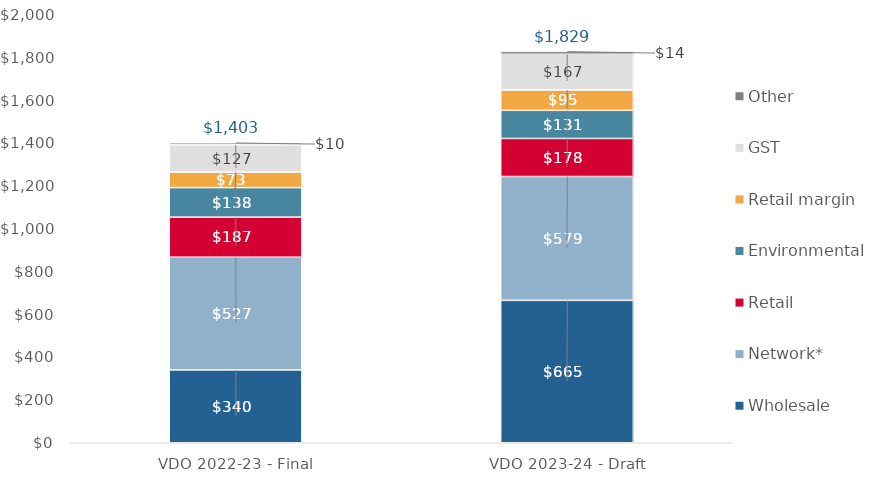
| Category | Wholesale | Network* | Retail | Environmental | Retail margin | GST | Other |
|---|---|---|---|---|---|---|---|
| VDO 2022-23 - Final | 340.448 | 526.528 | 187.359 | 137.938 | 72.5 | 127.283 | 9.769 |
| VDO 2023-24 - Draft | 665.41 | 578.7 | 177.837 | 131.464 | 94.997 | 166.779 | 13.714 |